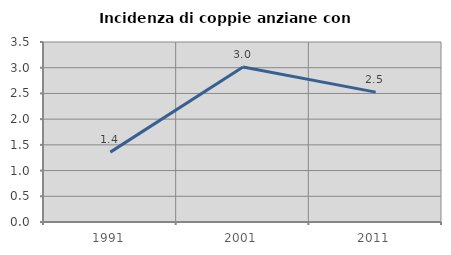
| Category | Incidenza di coppie anziane con figli |
|---|---|
| 1991.0 | 1.359 |
| 2001.0 | 3.015 |
| 2011.0 | 2.526 |